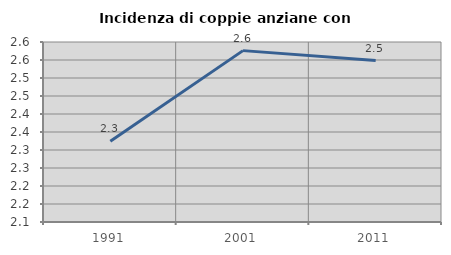
| Category | Incidenza di coppie anziane con figli |
|---|---|
| 1991.0 | 2.324 |
| 2001.0 | 2.576 |
| 2011.0 | 2.548 |